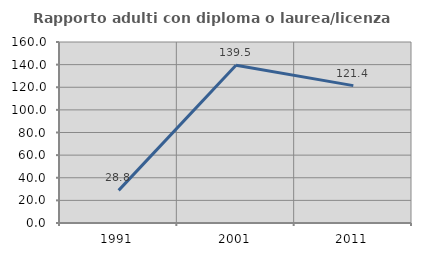
| Category | Rapporto adulti con diploma o laurea/licenza media  |
|---|---|
| 1991.0 | 28.846 |
| 2001.0 | 139.535 |
| 2011.0 | 121.429 |